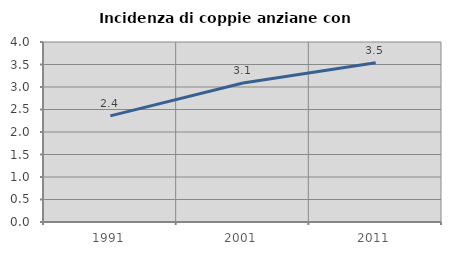
| Category | Incidenza di coppie anziane con figli |
|---|---|
| 1991.0 | 2.359 |
| 2001.0 | 3.087 |
| 2011.0 | 3.538 |